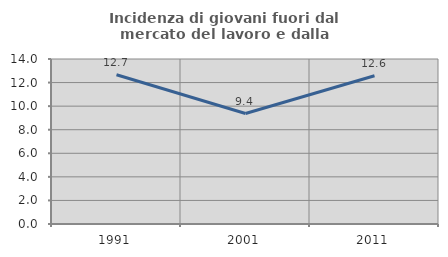
| Category | Incidenza di giovani fuori dal mercato del lavoro e dalla formazione  |
|---|---|
| 1991.0 | 12.661 |
| 2001.0 | 9.375 |
| 2011.0 | 12.581 |